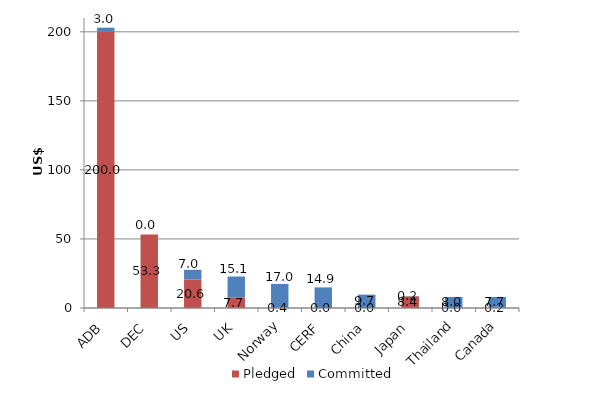
| Category | Pledged | Committed |
|---|---|---|
| ADB | 200 | 3 |
| DEC | 53.254 | 0 |
| US | 20.621 | 7.028 |
| UK | 7.704 | 15.101 |
| Norway | 0.387 | 17.029 |
| CERF | 0 | 14.914 |
| China | 0 | 9.679 |
| Japan | 8.4 | 0.208 |
| Thailand | 0 | 8.003 |
| Canada | 0.198 | 7.722 |